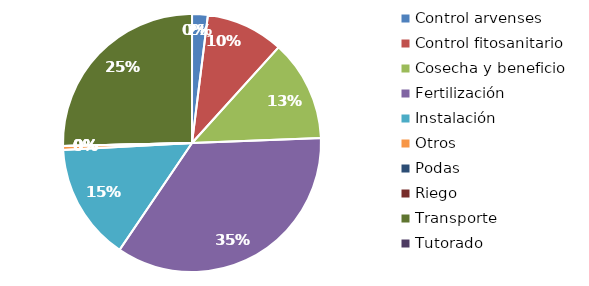
| Category | Valor |
|---|---|
| Control arvenses | 140000 |
| Control fitosanitario | 690000 |
| Cosecha y beneficio | 900000 |
| Fertilización | 2490000 |
| Instalación | 1040000 |
| Otros | 35000 |
| Podas | 0 |
| Riego | 0 |
| Transporte | 1800000 |
| Tutorado | 0 |